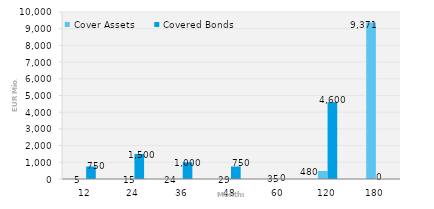
| Category | Cover Assets | Covered Bonds |
|---|---|---|
| 12.0 | 4.991 | 750 |
| 24.0 | 14.864 | 1500 |
| 36.0 | 23.694 | 1000 |
| 48.0 | 29.458 | 750 |
| 60.0 | 34.669 | 0 |
| 120.0 | 479.648 | 4600 |
| 180.0 | 9370.554 | 0 |